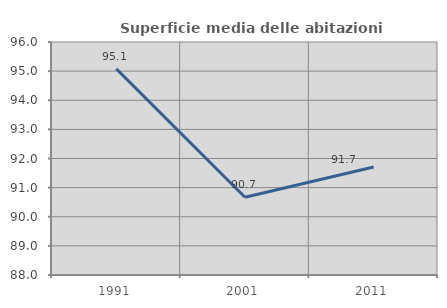
| Category | Superficie media delle abitazioni occupate |
|---|---|
| 1991.0 | 95.079 |
| 2001.0 | 90.669 |
| 2011.0 | 91.708 |